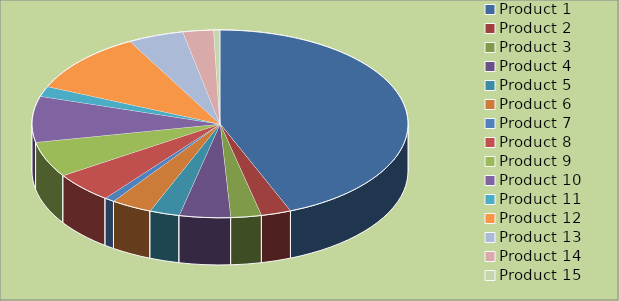
| Category | Series 0 |
|---|---|
| Product 1 | 5000 |
| Product 2 | 294 |
| Product 3 | 300 |
| Product 4 | 500 |
| Product 5 | 294 |
| Product 6 | 400 |
| Product 7 | 100 |
| Product 8 | 600 |
| Product 9 | 700 |
| Product 10 | 900 |
| Product 11 | 200 |
| Product 12 | 1200 |
| Product 13 | 544 |
| Product 14 | 300 |
| Product 15 | 60 |